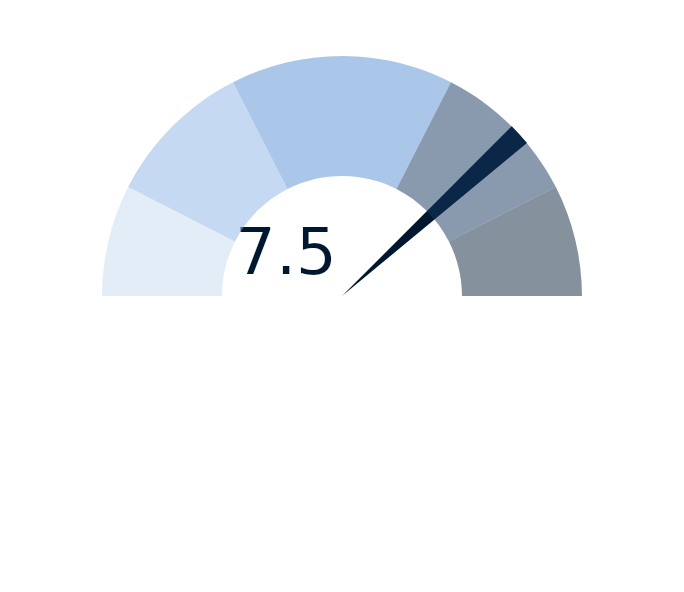
| Category | factor |
|---|---|
| 0 | 7.5 |
| 1 | 0.3 |
| 2 | 12.2 |